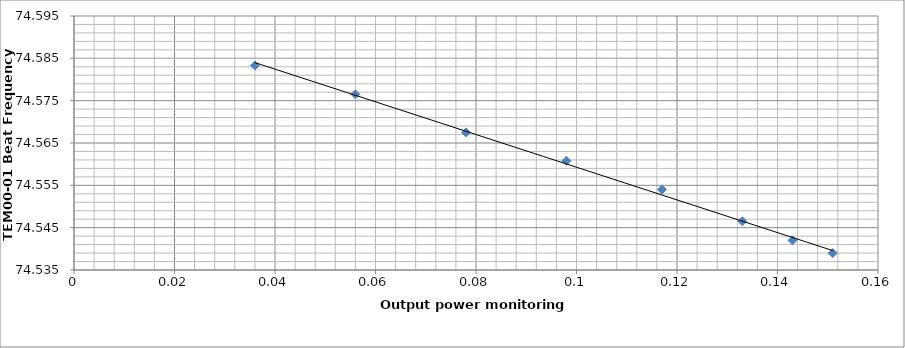
| Category | Series 0 |
|---|---|
| 0.151 | 74.539 |
| 0.143 | 74.542 |
| 0.133 | 74.546 |
| 0.117 | 74.554 |
| 0.098 | 74.561 |
| 0.078 | 74.568 |
| 0.056 | 74.576 |
| 0.036 | 74.583 |